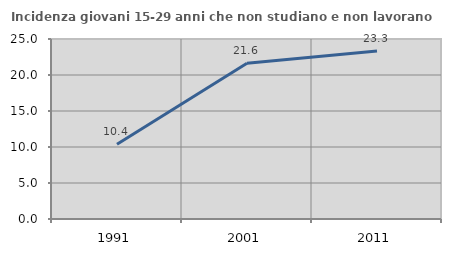
| Category | Incidenza giovani 15-29 anni che non studiano e non lavorano  |
|---|---|
| 1991.0 | 10.377 |
| 2001.0 | 21.622 |
| 2011.0 | 23.333 |